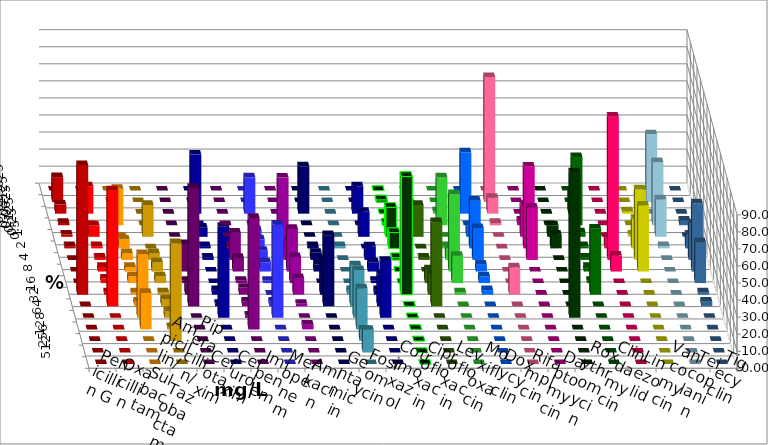
| Category | Penicillin G | Oxacillin | Ampicillin/ Sulbactam | Piperacillin/ Tazobactam | Cefotaxim | Cefuroxim | Imipenem | Meropenem | Amikacin | Gentamicin | Fosfomycin | Cotrimoxazol | Ciprofloxacin | Levofloxacin | Moxifloxacin | Doxycyclin | Rifampicin | Daptomycin | Roxythromycin | Clindamycin | Linezolid | Vancomycin | Teicoplanin | Tigecyclin |
|---|---|---|---|---|---|---|---|---|---|---|---|---|---|---|---|---|---|---|---|---|---|---|---|---|
| 0.015625 | 0 | 0 | 0 | 0 | 0 | 0 | 0 | 0 | 0 | 0 | 0 | 0 | 0 | 0 | 0 | 0 | 0 | 0 | 0 | 0 | 0 | 0 | 0 | 0 |
| 0.03125 | 14.667 | 0 | 0 | 0 | 0 | 0 | 0 | 0 | 0 | 0 | 0 | 0 | 1.333 | 0 | 0 | 0 | 73.333 | 0 | 0 | 0 | 0 | 0 | 0 | 39.726 |
| 0.0625 | 5.333 | 16 | 0 | 0 | 0 | 0 | 34.667 | 21.333 | 0 | 27.778 | 0 | 16 | 0 | 0 | 1.333 | 36 | 9.333 | 0 | 0 | 12 | 0 | 1.333 | 0 | 0 |
| 0.125 | 1.333 | 0 | 21.333 | 0 | 0 | 0 | 0 | 0 | 0 | 0 | 0 | 0 | 1.333 | 10.667 | 28 | 0 | 1.333 | 2.667 | 0 | 40 | 0 | 0 | 2.667 | 36.986 |
| 0.25 | 1.333 | 6.667 | 0 | 18.667 | 0 | 0 | 5.333 | 4 | 34.722 | 0 | 0 | 14.667 | 17.333 | 18.667 | 0 | 6.667 | 0 | 18.667 | 6.667 | 2.667 | 0 | 1.333 | 0 | 21.918 |
| 0.5 | 1.333 | 1.333 | 5.333 | 0 | 0 | 1.333 | 1.333 | 5.333 | 0 | 1.389 | 1.333 | 0 | 9.333 | 0 | 1.333 | 28 | 0 | 48 | 8 | 1.333 | 6.667 | 17.333 | 8 | 1.37 |
| 1.0 | 0 | 1.333 | 4 | 4 | 6.667 | 16 | 1.333 | 5.333 | 11.111 | 4.167 | 0 | 8 | 1.333 | 1.333 | 6.667 | 18.667 | 0 | 30.667 | 0 | 1.333 | 84 | 41.333 | 21.333 | 0 |
| 2.0 | 0 | 2.667 | 2.667 | 5.333 | 16 | 8 | 0 | 5.333 | 25 | 4.167 | 0 | 5.333 | 0 | 0 | 45.333 | 4 | 0 | 0 | 0 | 2.667 | 9.333 | 38.667 | 40 | 0 |
| 4.0 | 0 | 2.667 | 4 | 4 | 1.333 | 1.333 | 0 | 1.333 | 15.278 | 0 | 0 | 1.333 | 0 | 8 | 16 | 4 | 0 | 0 | 0 | 1.333 | 0 | 0 | 24 | 0 |
| 8.0 | 76 | 1.333 | 1.333 | 1.333 | 6.667 | 4 | 2.667 | 0 | 9.722 | 20.833 | 2.667 | 2.667 | 69.333 | 12 | 1.333 | 2.667 | 16 | 0 | 0 | 38.667 | 0 | 0 | 1.333 | 0 |
| 16.0 | 0 | 68 | 2.667 | 4 | 69.333 | 2.667 | 1.333 | 2.667 | 1.389 | 41.667 | 24 | 18.667 | 0 | 49.333 | 0 | 0 | 0 | 0 | 0 | 0 | 0 | 0 | 2.667 | 0 |
| 32.0 | 0 | 0 | 37.333 | 4 | 0 | 1.333 | 53.333 | 54.667 | 0 | 0 | 28 | 33.333 | 0 | 0 | 0 | 0 | 0 | 0 | 85.333 | 0 | 0 | 0 | 0 | 0 |
| 64.0 | 0 | 0 | 21.333 | 1.333 | 0 | 65.333 | 0 | 0 | 2.778 | 0 | 24 | 0 | 0 | 0 | 0 | 0 | 0 | 0 | 0 | 0 | 0 | 0 | 0 | 0 |
| 128.0 | 0 | 0 | 0 | 57.333 | 0 | 0 | 0 | 0 | 0 | 0 | 6.667 | 0 | 0 | 0 | 0 | 0 | 0 | 0 | 0 | 0 | 0 | 0 | 0 | 0 |
| 256.0 | 0 | 0 | 0 | 0 | 0 | 0 | 0 | 0 | 0 | 0 | 13.333 | 0 | 0 | 0 | 0 | 0 | 0 | 0 | 0 | 0 | 0 | 0 | 0 | 0 |
| 512.0 | 0 | 0 | 0 | 0 | 0 | 0 | 0 | 0 | 0 | 0 | 0 | 0 | 0 | 0 | 0 | 0 | 0 | 0 | 0 | 0 | 0 | 0 | 0 | 0 |